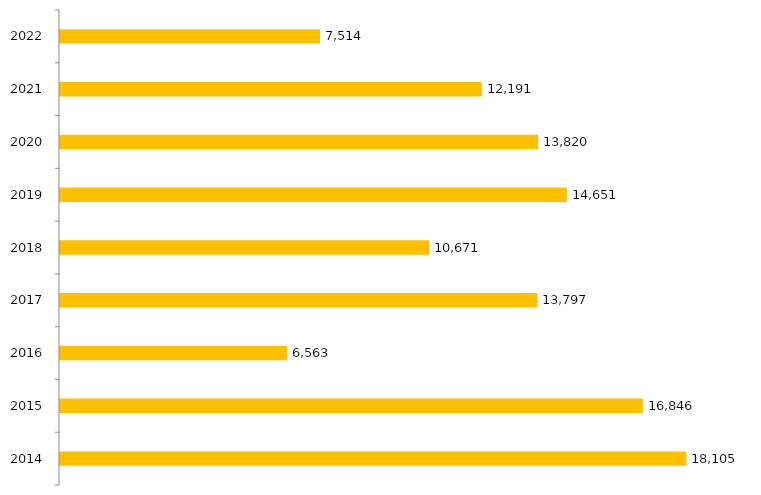
| Category | Inscritos |
|---|---|
| 2014.0 | 18105 |
| 2015.0 | 16846 |
| 2016.0 | 6563 |
| 2017.0 | 13797 |
| 2018.0 | 10671 |
| 2019.0 | 14651 |
| 2020.0 | 13820 |
| 2021.0 | 12191 |
| 2022.0 | 7514 |